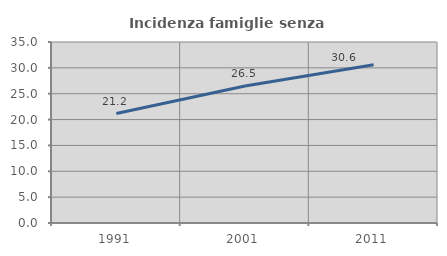
| Category | Incidenza famiglie senza nuclei |
|---|---|
| 1991.0 | 21.169 |
| 2001.0 | 26.497 |
| 2011.0 | 30.584 |